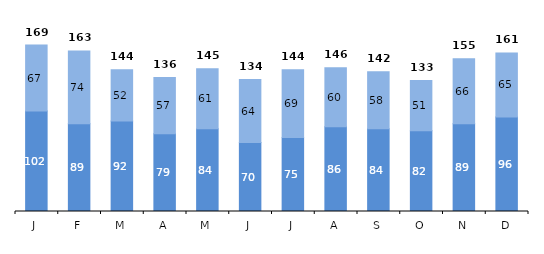
| Category | Abteilung A | Series 1 |
|---|---|---|
| J | 102 | 67 |
| F | 89 | 74 |
| M | 92 | 52 |
| A | 79 | 57 |
| M | 84 | 61 |
| J | 70 | 64 |
| J | 75 | 69 |
| A | 86 | 60 |
| S | 84 | 58 |
| O | 82 | 51 |
| N | 89 | 66 |
| D | 96 | 65 |